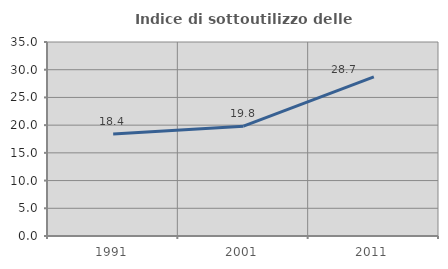
| Category | Indice di sottoutilizzo delle abitazioni  |
|---|---|
| 1991.0 | 18.384 |
| 2001.0 | 19.816 |
| 2011.0 | 28.71 |